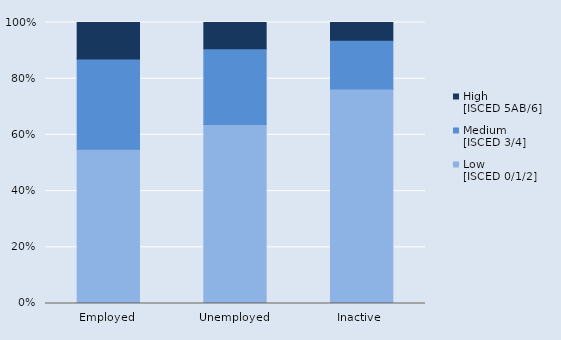
| Category | Low
[ISCED 0/1/2] | Medium 
[ISCED 3/4] | High 
[ISCED 5AB/6] |
|---|---|---|---|
| Employed | 492029 | 287250 | 116609 |
| Unemployed | 52346 | 22146 | 7704 |
| Inactive  | 331414 | 75358 | 27263 |